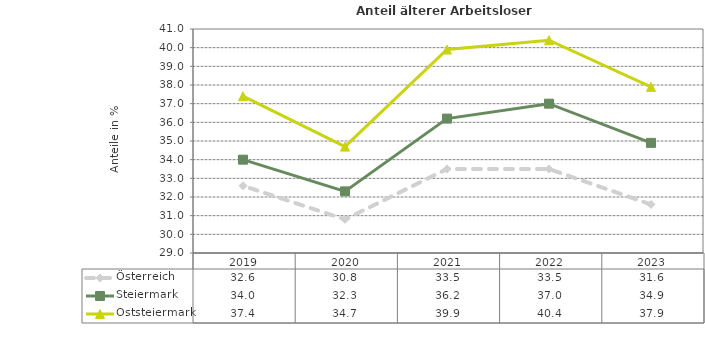
| Category | Österreich | Steiermark | Oststeiermark |
|---|---|---|---|
| 2023.0 | 31.6 | 34.9 | 37.9 |
| 2022.0 | 33.5 | 37 | 40.4 |
| 2021.0 | 33.5 | 36.2 | 39.9 |
| 2020.0 | 30.8 | 32.3 | 34.7 |
| 2019.0 | 32.6 | 34 | 37.4 |